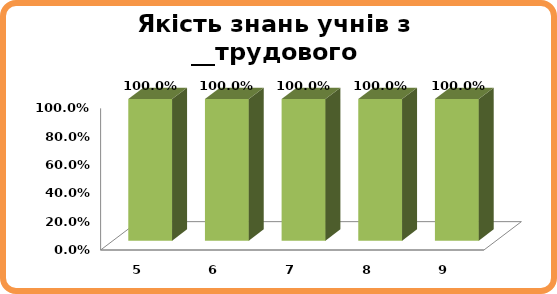
| Category | Series 0 |
|---|---|
| 5.0 | 1 |
| 6.0 | 1 |
| 7.0 | 1 |
| 8.0 | 1 |
| 9.0 | 1 |